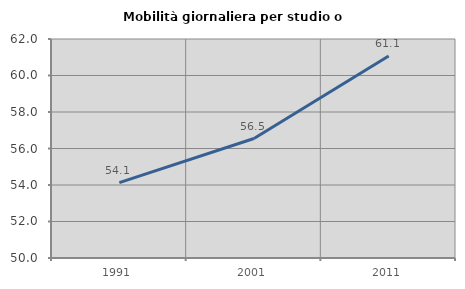
| Category | Mobilità giornaliera per studio o lavoro |
|---|---|
| 1991.0 | 54.128 |
| 2001.0 | 56.547 |
| 2011.0 | 61.07 |